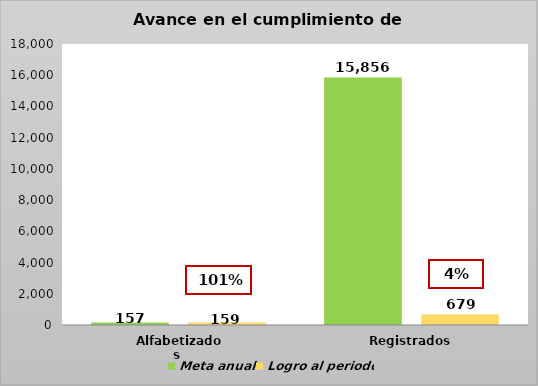
| Category | Meta anual | Logro al periodo |
|---|---|---|
| Alfabetizados  | 157 | 159 |
| Registrados | 15856 | 679 |